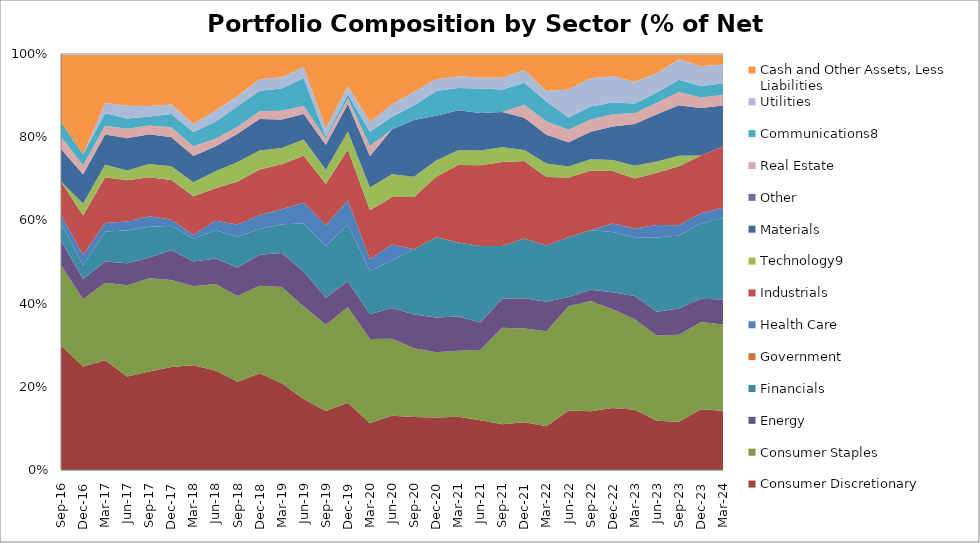
| Category | Consumer Discretionary | Consumer Staples | Energy | Financials | Government | Health Care | Industrials | Technology9 | Materials | Other | Real Estate | Communications8 | Utilities | Cash and Other Assets, Less Liabilities |
|---|---|---|---|---|---|---|---|---|---|---|---|---|---|---|
| 2016-09-30 | 29.91 | 19.3 | 5.89 | 4.16 | 0 | 2.07 | 8.02 | 0 | 7.84 | 0 | 2.91 | 3.56 | 0 | 16.34 |
| 2016-12-31 | 24.859 | 16.21 | 4.85 | 3.31 | 0 | 2.48 | 9.454 | 2.88 | 7.036 | 0 | 2.2 | 2.63 | 0 | 24.09 |
| 2017-03-31 | 26.377 | 18.625 | 5.11 | 7.21 | 0 | 2.04 | 10.976 | 3.02 | 7.29 | 0 | 2.07 | 3 | 2.48 | 11.79 |
| 2017-06-30 | 22.501 | 21.9 | 5.281 | 7.868 | 0 | 2.209 | 9.877 | 2.336 | 7.778 | 0 | 2.297 | 2.439 | 3.079 | 12.434 |
| 2017-09-30 | 23.67 | 22.42 | 5.01 | 7.39 | 0 | 2.49 | 9.4 | 3.18 | 7.14 | 0 | 2.13 | 2.12 | 2.54 | 12.51 |
| 2017-12-31 | 24.74 | 20.94 | 7.19 | 5.86 | 0 | 1.41 | 9.6 | 3.26 | 7 | 0 | 2.4 | 3.17 | 2.3 | 12.13 |
| 2018-03-31 | 25.17 | 18.99 | 5.95 | 5.56 | 0 | 0.84 | 9.3 | 3.35 | 6.36 | 0 | 2.33 | 3.37 | 2.03 | 16.75 |
| 2018-06-30 | 23.94 | 20.78 | 6.13 | 6.76 | 0 | 2.28 | 7.85 | 4.07 | 5.984 | 0 | 1.86 | 4.06 | 2.69 | 13.6 |
| 2018-09-30 | 21.21 | 20.61 | 6.83 | 7.45 | 0 | 2.94 | 10.3 | 4.7 | 6.78 | 0 | 1.68 | 4.92 | 2.5 | 10.08 |
| 2018-12-31 | 23.27 | 21.04 | 7.43 | 6.2 | 0 | 3.33 | 10.96 | 4.55 | 7.6 | 0 | 1.87 | 4.92 | 2.79 | 6.04 |
| 2019-03-31 | 20.84 | 23.17 | 8.17 | 6.91 | 0 | 3.58 | 10.81 | 3.91 | 6.84 | 0 | 2.15 | 5.32 | 2.7 | 5.6 |
| 2019-06-30 | 17.08 | 22.21 | 8.44 | 11.54 | 0 | 5 | 11.25 | 3.93 | 6.11 | 0 | 1.94 | 6.72 | 2.6 | 3.18 |
| 2019-09-30 | 14.19 | 20.72 | 6.5 | 12.46 | 0 | 4.94 | 9.92 | 3.44 | 5.99 | 0 | 1.48 | 0.45 | 2.04 | 17.87 |
| 2019-12-31 | 16.19 | 22.95 | 6.23 | 13.66 | 0 | 5.74 | 12.28 | 4.35 | 6.57 | 0 | 1.35 | 1.02 | 1.98 | 7.68 |
| 2020-03-31 | 11.3 | 20.19 | 5.97 | 10.33 | 0 | 2.85 | 11.82 | 5.43 | 7.62 | 0 | 2.4 | 3.39 | 2.38 | 16.32 |
| 2020-06-30 | 13.02 | 18.52 | 7.41 | 11.45 | 0 | 3.81 | 11.44 | 5.46 | 10.83 | 0 | 0 | 2.95 | 3.02 | 12.09 |
| 2020-09-30 | 12.77 | 16.47 | 8.16 | 15.67 | 0 | 0 | 12.55 | 4.88 | 13.62 | 0 | 0 | 3.57 | 3.26 | 9.05 |
| 2020-12-31 | 12.61 | 15.7 | 8.33 | 19.33 | 0 | 0 | 14.53 | 3.89 | 10.79 | 0 | 0 | 5.95 | 2.83 | 6.04 |
| 2021-03-31 | 12.81 | 15.87 | 8.24 | 17.79 | 0 | 0 | 18.59 | 3.54 | 9.62 | 0 | 0 | 5.34 | 2.83 | 5.37 |
| 2021-06-30 | 11.95 | 16.89 | 6.63 | 18.36 | 0 | 0 | 19.45 | 3.5 | 9.02 | 0 | 0 | 5.93 | 2.6 | 5.67 |
| 2021-09-30 | 10.98 | 23.23 | 7 | 12.65 | 0 | 0 | 20.2 | 3.51 | 8.49 | 0 | 0 | 5.39 | 2.87 | 5.68 |
| 2021-12-31 | 11.49 | 22.53 | 7.27 | 14.36 | 0 | 0 | 18.61 | 2.64 | 7.79 | 0 | 3.09 | 5.31 | 3.04 | 3.87 |
| 2022-03-31 | 10.52 | 22.85 | 7.07 | 13.55 | 0 | 0 | 16.44 | 3.26 | 6.88 | 0 | 3.2 | 4.81 | 2.5 | 8.92 |
| 2022-06-30 | 14.31 | 25.07 | 2.23 | 14.33 | 0 | 0 | 14.37 | 2.67 | 5.81 | 0 | 3.03 | 2.94 | 6.68 | 8.56 |
| 2022-09-30 | 14.12 | 26.48 | 2.71 | 14.35 | 0 | 0 | 14.31 | 2.73 | 6.64 | 0 | 2.93 | 3.09 | 6.83 | 5.81 |
| 2022-12-31 | 14.88 | 23.75 | 4.1 | 14.48 | 0 | 2.05 | 12.6 | 2.66 | 8.08 | 0 | 2.94 | 2.82 | 6.29 | 5.35 |
| 2023-03-31 | 14.51 | 21.72 | 5.62 | 14.07 | 0 | 2.13 | 12.04 | 3.07 | 10.01 | 0 | 2.6 | 2.34 | 5.24 | 6.65 |
| 2023-06-30 | 11.85 | 20.49 | 5.7 | 17.84 | 0 | 3.04 | 12.56 | 2.7 | 11.36 | 0 | 2.73 | 2.46 | 4.62 | 4.65 |
| 2023-09-30 | 11.59 | 20.95 | 6.28 | 17.56 | 0 | 2.43 | 14.2 | 2.53 | 12.12 | 0 | 3.23 | 2.91 | 4.96 | 1.24 |
| 2023-12-31 | 14.63 | 20.92 | 5.61 | 18.1 | 0 | 2.48 | 13.89 | 0 | 11.4 | 0 | 2.52 | 2.76 | 4.77 | 2.92 |
| 2024-03-31 | 14.26 | 20.74 | 5.98 | 19.56 | 0 | 2.5 | 14.71 | 0 | 9.87 | 0 | 2.55 | 2.72 | 4.56 | 2.55 |